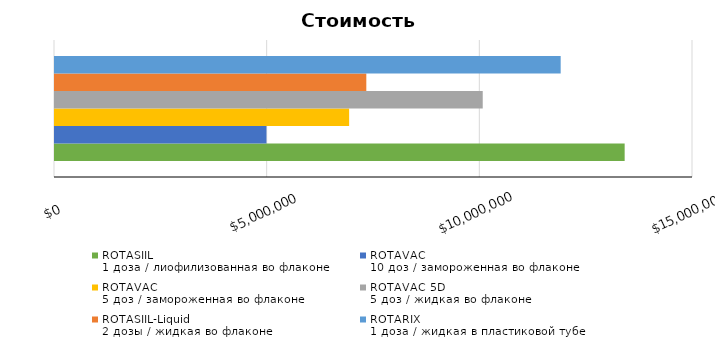
| Category | ROTASIIL
1 доза / лиофилизованная во флаконе | ROTAVAC
10 доз / замороженная во флаконе | ROTAVAC
5 доз / замороженная во флаконе | ROTAVAC 5D
5 доз / жидкая во флаконе | ROTASIIL-Liquid
2 дозы / жидкая во флаконе | ROTARIX
1 доза / жидкая в пластиковой тубе |
|---|---|---|---|---|---|---|
| Всего
на 5 лет | 13393255.948 | 4971406.986 | 6915385.489 | 10056293.713 | 7319334.871 | 11889063.361 |